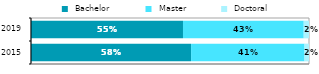
| Category |  Bachelor |  Master |  Doctoral |
|---|---|---|---|
| 2015.0 | 0.576 | 0.408 | 0.016 |
| 2019.0 | 0.547 | 0.434 | 0.019 |